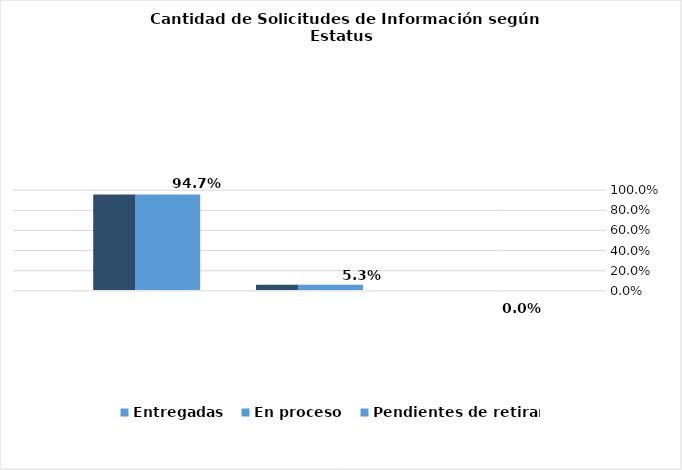
| Category | Entregadas | En proceso | Pendientes de retirar |
|---|---|---|---|
|  | 0.947 | 0.053 | 0 |